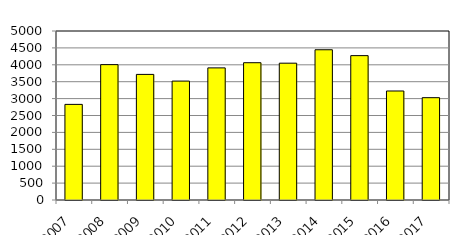
| Category | Series 1 |
|---|---|
| 2007 | 2829 |
| 2008 | 4005 |
| 2009 | 3716 |
| 2010 | 3518 |
| 2011 | 3909 |
| 2012 | 4062 |
| 2013 | 4048 |
| 2014 | 4445 |
| 2015 | 4271 |
| 2016 | 3225 |
| 2017 | 3027 |